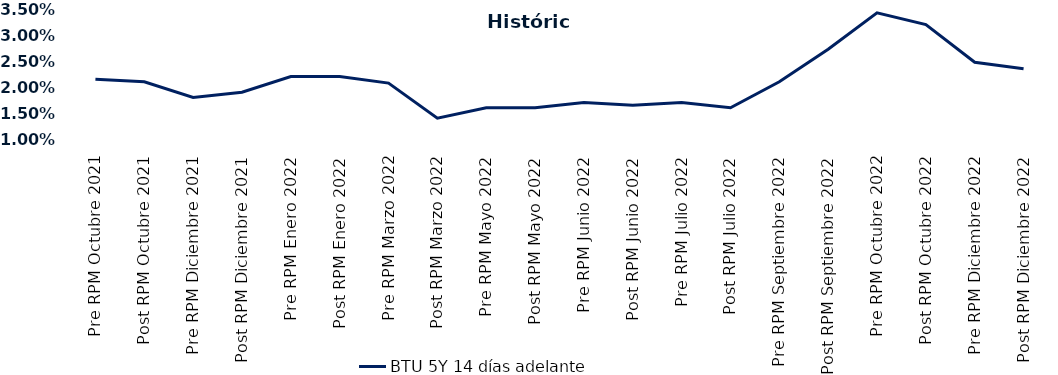
| Category | BTU 5Y 14 días adelante |
|---|---|
| Pre RPM Octubre 2021 | 0.022 |
| Post RPM Octubre 2021 | 0.021 |
| Pre RPM Diciembre 2021 | 0.018 |
| Post RPM Diciembre 2021 | 0.019 |
| Pre RPM Enero 2022 | 0.022 |
| Post RPM Enero 2022 | 0.022 |
| Pre RPM Marzo 2022 | 0.021 |
| Post RPM Marzo 2022 | 0.014 |
| Pre RPM Mayo 2022 | 0.016 |
| Post RPM Mayo 2022 | 0.016 |
| Pre RPM Junio 2022 | 0.017 |
| Post RPM Junio 2022 | 0.016 |
| Pre RPM Julio 2022 | 0.017 |
| Post RPM Julio 2022 | 0.016 |
| Pre RPM Septiembre 2022 | 0.021 |
| Post RPM Septiembre 2022 | 0.027 |
| Pre RPM Octubre 2022 | 0.034 |
| Post RPM Octubre 2022 | 0.032 |
| Pre RPM Diciembre 2022 | 0.025 |
| Post RPM Diciembre 2022 | 0.024 |